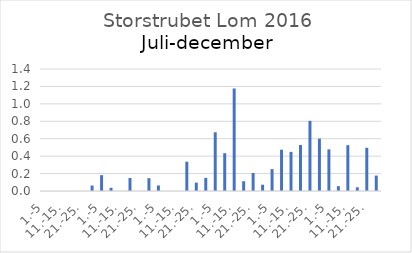
| Category | Series 0 |
|---|---|
| 1.-5 | 0 |
| 6.-10. | 0 |
| 11.-15. | 0 |
| 16.-20. | 0 |
| 21.-25. | 0 |
| 26.-31. | 0.063 |
| 1.-5 | 0.182 |
| 6.-10. | 0.037 |
| 11.-15. | 0 |
| 16.-20. | 0.15 |
| 21.-25. | 0 |
| 26.-31. | 0.147 |
| 1.-5 | 0.064 |
| 6.-10. | 0 |
| 11.-15. | 0 |
| 16.-20. | 0.336 |
| 21.-25. | 0.096 |
| 26.-30. | 0.151 |
| 1.-5 | 0.674 |
| 6.-10. | 0.434 |
| 11.-15. | 1.176 |
| 16.-20. | 0.112 |
| 21.-25. | 0.207 |
| 26.-31. | 0.072 |
| 1.-5 | 0.251 |
| 6.-10. | 0.474 |
| 11.-15. | 0.449 |
| 16.-20. | 0.528 |
| 21.-25. | 0.805 |
| 26.-30. | 0.601 |
| 1.-5 | 0.477 |
| 6.-10. | 0.056 |
| 11.-15. | 0.526 |
| 16.-20. | 0.043 |
| 21.-25. | 0.496 |
| 26.-31. | 0.177 |